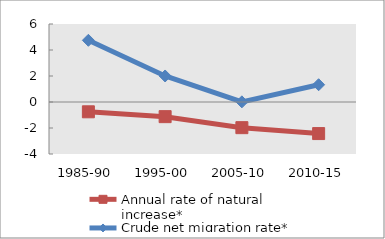
| Category | Annual rate of natural increase* | Crude net migration rate* |
|---|---|---|
| 1985-90 | -0.754 | 4.746 |
| 1995-00 | -1.127 | 2.002 |
| 2005-10 | -1.974 | 0.012 |
| 2010-15 | -2.429 | 1.329 |